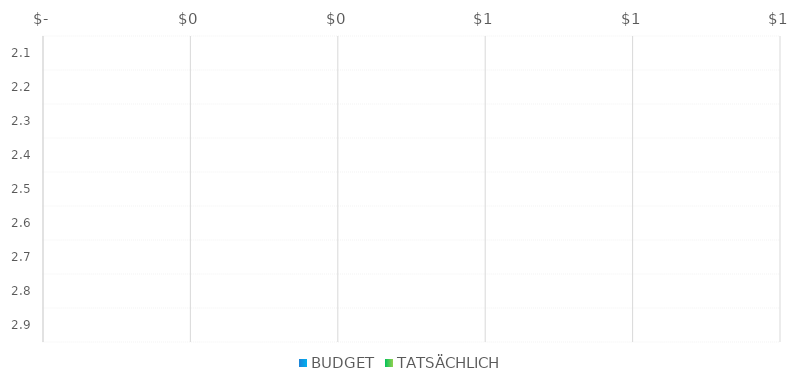
| Category | BUDGET | TATSÄCHLICH |
|---|---|---|
| 2.1 |  | 0 |
| 2.2 |  | 0 |
| 2.3 |  | 0 |
| 2.4 |  | 0 |
| 2.5 |  | 0 |
| 2.6 |  | 0 |
| 2.7 |  | 0 |
| 2.8 |  | 0 |
| 2.9 |  | 0 |